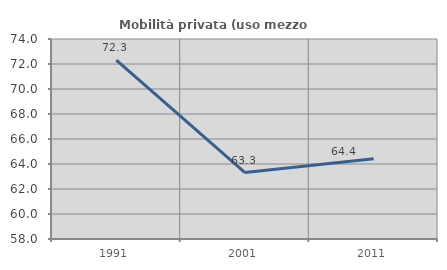
| Category | Mobilità privata (uso mezzo privato) |
|---|---|
| 1991.0 | 72.308 |
| 2001.0 | 63.314 |
| 2011.0 | 64.417 |